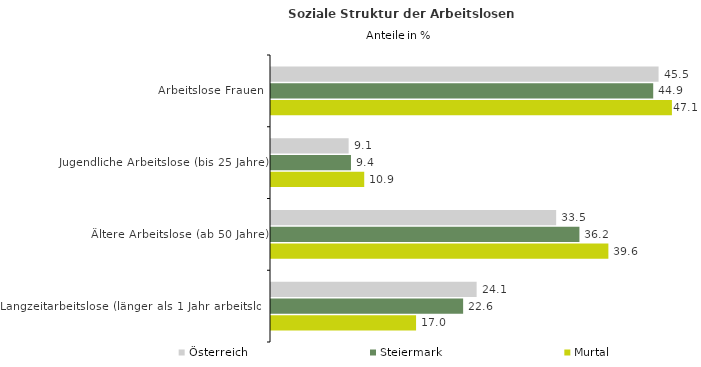
| Category | Österreich | Steiermark | Murtal |
|---|---|---|---|
| Arbeitslose Frauen | 45.49 | 44.861 | 47.056 |
| Jugendliche Arbeitslose (bis 25 Jahre) | 9.111 | 9.387 | 10.942 |
| Ältere Arbeitslose (ab 50 Jahre) | 33.469 | 36.201 | 39.598 |
| Langzeitarbeitslose (länger als 1 Jahr arbeitslos) | 24.136 | 22.55 | 17.026 |